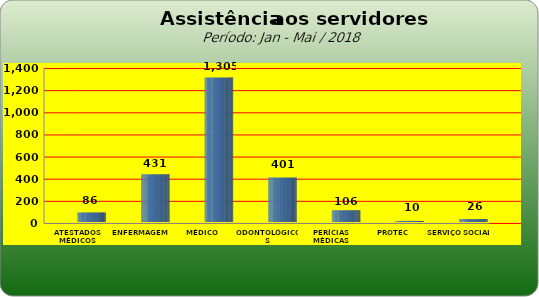
| Category | Series 0 |
|---|---|
| ATESTADOS MÉDICOS | 86 |
| ENFERMAGEM | 431 |
| MÉDICO | 1305 |
| ODONTOLÓGICOS | 401 |
| PERÍCIAS MÉDICAS | 106 |
| PROTEC | 10 |
| SERVIÇO SOCIAL | 26 |